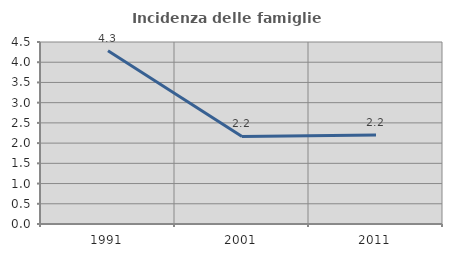
| Category | Incidenza delle famiglie numerose |
|---|---|
| 1991.0 | 4.283 |
| 2001.0 | 2.164 |
| 2011.0 | 2.203 |